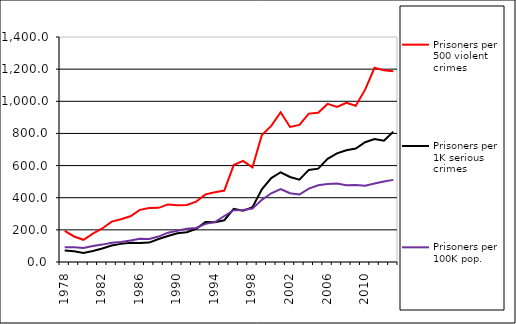
| Category | Prisoners per 500 violent crimes | Prisoners per 1K serious crimes | Prisoners per 100K pop. |
|---|---|---|---|
| 1978.0 | 193.16 | 71.652 | 91.344 |
| 1979.0 | 158.821 | 67.25 | 91.713 |
| 1980.0 | 138.147 | 55.776 | 86.581 |
| 1981.0 | 176.113 | 68.494 | 99.791 |
| 1982.0 | 208.717 | 83.795 | 108.187 |
| 1983.0 | 251.377 | 102.62 | 120.02 |
| 1984.0 | 266.03 | 112.822 | 125.175 |
| 1985.0 | 284.746 | 119.181 | 133.731 |
| 1986.0 | 324.373 | 117.752 | 144.367 |
| 1987.0 | 335.594 | 120.73 | 143.788 |
| 1988.0 | 337.1 | 143.258 | 158.258 |
| 1989.0 | 358.249 | 161.926 | 182.446 |
| 1990.0 | 353.206 | 178.874 | 194.785 |
| 1991.0 | 355.272 | 184.773 | 206.256 |
| 1992.0 | 375.624 | 206.272 | 211.434 |
| 1993.0 | 420.73 | 249.45 | 237.125 |
| 1994.0 | 434.064 | 246.904 | 248.102 |
| 1995.0 | 444.326 | 259.716 | 286.156 |
| 1996.0 | 603.085 | 330.117 | 322.288 |
| 1997.0 | 629.385 | 318.433 | 323.223 |
| 1998.0 | 588.668 | 340.647 | 332.221 |
| 1999.0 | 789.628 | 452.228 | 386.834 |
| 2000.0 | 847.107 | 522.318 | 427.759 |
| 2001.0 | 931.797 | 558.313 | 453.133 |
| 2002.0 | 840.304 | 529.098 | 427.809 |
| 2003.0 | 853.212 | 512.278 | 419.668 |
| 2004.0 | 923.378 | 573.137 | 456.943 |
| 2005.0 | 928.883 | 580.948 | 476.994 |
| 2006.0 | 983.706 | 641.628 | 485.794 |
| 2007.0 | 965.058 | 676.183 | 488.128 |
| 2008.0 | 991.028 | 695.412 | 477.249 |
| 2009.0 | 972.405 | 705.636 | 478.716 |
| 2010.0 | 1072.294 | 745.56 | 474.042 |
| 2011.0 | 1208.463 | 764.95 | 488.652 |
| 2012.0 | 1192.503 | 754.156 | 500.442 |
| 2013.0 | 1187.266 | 810.901 | 511.023 |